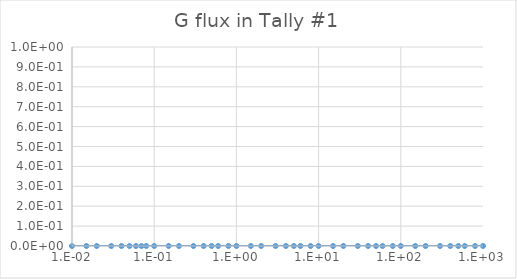
| Category | Series 0 |
|---|---|
| 0.01 | 0 |
| 0.015 | 0 |
| 0.02 | 0 |
| 0.03 | 0 |
| 0.04 | 0 |
| 0.05 | 0 |
| 0.06 | 0 |
| 0.07 | 0 |
| 0.08 | 0 |
| 0.1 | 0 |
| 0.15 | 0 |
| 0.2 | 0 |
| 0.3 | 0 |
| 0.4 | 0 |
| 0.5 | 0 |
| 0.6 | 0 |
| 0.8 | 0 |
| 1.0 | 0 |
| 1.5 | 0 |
| 2.0 | 0 |
| 3.0 | 0 |
| 4.0 | 0 |
| 5.0 | 0 |
| 6.0 | 0 |
| 8.0 | 0 |
| 10.0 | 0 |
| 15.0 | 0 |
| 20.0 | 0 |
| 30.0 | 0 |
| 40.0 | 0 |
| 50.0 | 0 |
| 60.0 | 0 |
| 80.0 | 0 |
| 100.0 | 0 |
| 150.0 | 0 |
| 200.0 | 0 |
| 300.0 | 0 |
| 400.0 | 0 |
| 500.0 | 0 |
| 600.0 | 0 |
| 800.0 | 0 |
| 1000.0 | 0 |
| 1500.0 | 0 |
| 2000.0 | 0 |
| 3000.0 | 0 |
| 4000.0 | 0 |
| 5000.0 | 0 |
| 6000.0 | 0 |
| 8000.0 | 0 |
| 10000.0 | 0 |